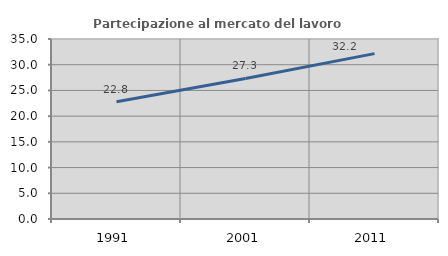
| Category | Partecipazione al mercato del lavoro  femminile |
|---|---|
| 1991.0 | 22.807 |
| 2001.0 | 27.325 |
| 2011.0 | 32.16 |